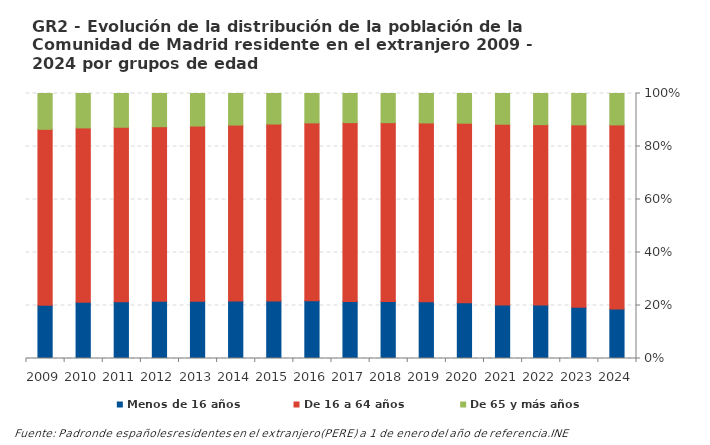
| Category | Menos de 16 años | De 16 a 64 años | De 65 y más años |
|---|---|---|---|
| 2024.0 | 96144 | 358394 | 61108 |
| 2023.0 | 91469 | 326253 | 56115 |
| 2022.0 | 91002 | 307016 | 53014 |
| 2021.0 | 86344 | 291209 | 49535 |
| 2020.0 | 88179 | 283620 | 46891 |
| 2019.0 | 85579 | 270098 | 44460 |
| 2018.0 | 82932 | 260137 | 42403 |
| 2017.0 | 79206 | 247837 | 40391 |
| 2016.0 | 75191 | 231117 | 38239 |
| 2015.0 | 69100 | 212181 | 36616 |
| 2014.0 | 63619 | 194438 | 34901 |
| 2013.0 | 57965 | 177348 | 32931 |
| 2012.0 | 53916 | 164680 | 31311 |
| 2011.0 | 49937 | 153254 | 29667 |
| 2010.0 | 45821 | 141638 | 27997 |
| 2009.0 | 39708 | 131154 | 26683 |